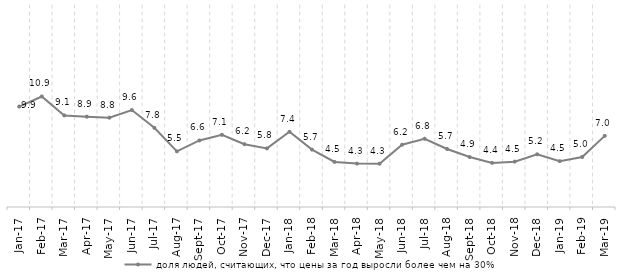
| Category | доля людей, считающих, что цены за год выросли более чем на 30% |
|---|---|
| 2017-01-01 | 9.946 |
| 2017-02-01 | 10.942 |
| 2017-03-01 | 9.066 |
| 2017-04-01 | 8.939 |
| 2017-05-01 | 8.844 |
| 2017-06-01 | 9.6 |
| 2017-07-01 | 7.841 |
| 2017-08-01 | 5.509 |
| 2017-09-01 | 6.587 |
| 2017-10-01 | 7.147 |
| 2017-11-01 | 6.218 |
| 2017-12-01 | 5.8 |
| 2018-01-01 | 7.445 |
| 2018-02-01 | 5.682 |
| 2018-03-01 | 4.463 |
| 2018-04-01 | 4.296 |
| 2018-05-01 | 4.287 |
| 2018-06-01 | 6.164 |
| 2018-07-01 | 6.758 |
| 2018-08-01 | 5.744 |
| 2018-09-01 | 4.946 |
| 2018-10-01 | 4.368 |
| 2018-11-01 | 4.491 |
| 2018-12-01 | 5.219 |
| 2019-01-01 | 4.543 |
| 2019-02-01 | 4.953 |
| 2019-03-01 | 7.044 |